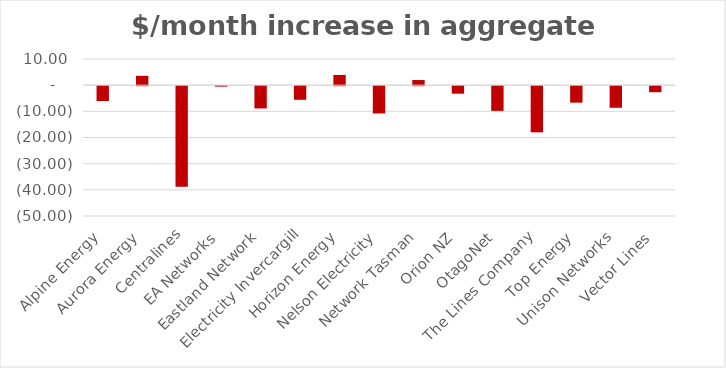
| Category | $/month increase in aggregate prices |
|---|---|
| Alpine Energy | -5.675 |
| Aurora Energy | 3.572 |
| Centralines | -38.405 |
| EA Networks | -0.172 |
| Eastland Network | -8.516 |
| Electricity Invercargill | -5.206 |
| Horizon Energy | 3.916 |
| Nelson Electricity | -10.432 |
| Network Tasman | 1.961 |
| Orion NZ | -2.872 |
| OtagoNet | -9.436 |
| The Lines Company | -17.646 |
| Top Energy | -6.299 |
| Unison Networks | -8.252 |
| Vector Lines | -2.317 |